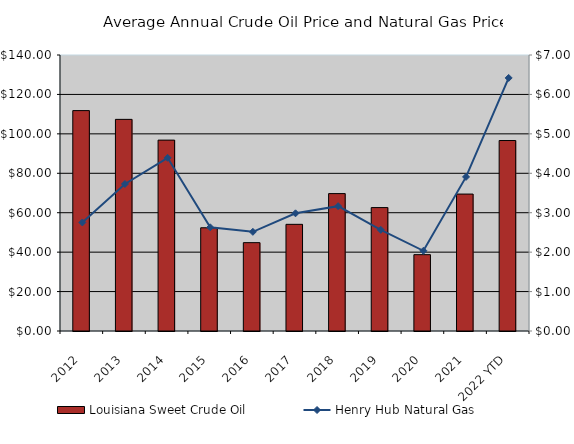
| Category | Louisiana Sweet Crude Oil |
|---|---|
| 2012 | 111.794 |
| 2013 | 107.349 |
| 2014 | 96.825 |
| 2015 | 52.363 |
| 2016 | 44.813 |
| 2017 | 54.102 |
| 2018 | 69.693 |
| 2019 | 62.599 |
| 2020 | 38.719 |
| 2021 | 69.461 |
| 2022 YTD | 96.617 |